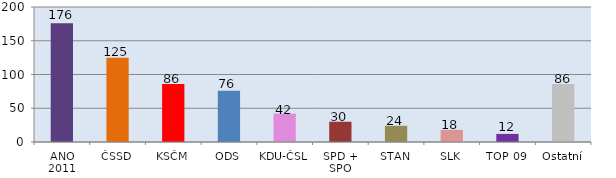
| Category | Počet mandátů |
|---|---|
| ANO 2011 | 176 |
| ČSSD | 125 |
| KSČM | 86 |
| ODS | 76 |
| KDU-ČSL | 42 |
| SPD + SPO | 30 |
| STAN | 24 |
| SLK | 18 |
| TOP 09 | 12 |
| Ostatní | 86 |